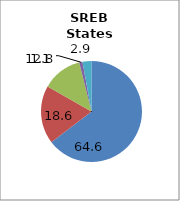
| Category | SREB states2 |
|---|---|
| White | 64.611 |
| Black | 18.618 |
| Hispanic | 12.842 |
| Two or More Races | 1.073 |
| All Other1 | 2.855 |